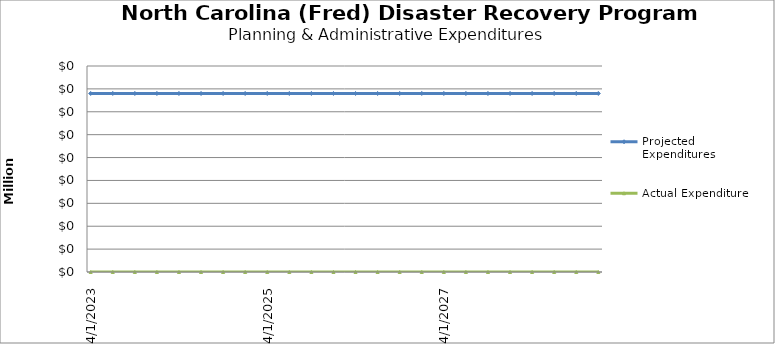
| Category | Projected Expenditures | Actual Expenditure |
|---|---|---|
| 4/1/23 | 39000 | 0 |
| 7/1/23 | 39000 | 0 |
| 10/1/23 | 39000 | 0 |
| 1/1/24 | 39000 | 0 |
| 4/1/24 | 39000 | 0 |
| 7/1/24 | 39000 | 0 |
| 10/1/24 | 39000 | 0 |
| 1/1/25 | 39000 | 0 |
| 4/1/25 | 39000 | 0 |
| 7/1/25 | 39000 | 0 |
| 10/1/25 | 39000 | 0 |
| 1/1/26 | 39000 | 0 |
| 4/1/26 | 39000 | 0 |
| 7/1/26 | 39000 | 0 |
| 10/1/26 | 39000 | 0 |
| 1/1/27 | 39000 | 0 |
| 4/1/27 | 39000 | 0 |
| 7/1/27 | 39000 | 0 |
| 10/1/27 | 39000 | 0 |
| 1/1/28 | 39000 | 0 |
| 4/1/28 | 39000 | 0 |
| 7/1/28 | 39000 | 0 |
| 10/1/28 | 39000 | 0 |
| 1/1/29 | 39000 | 0 |